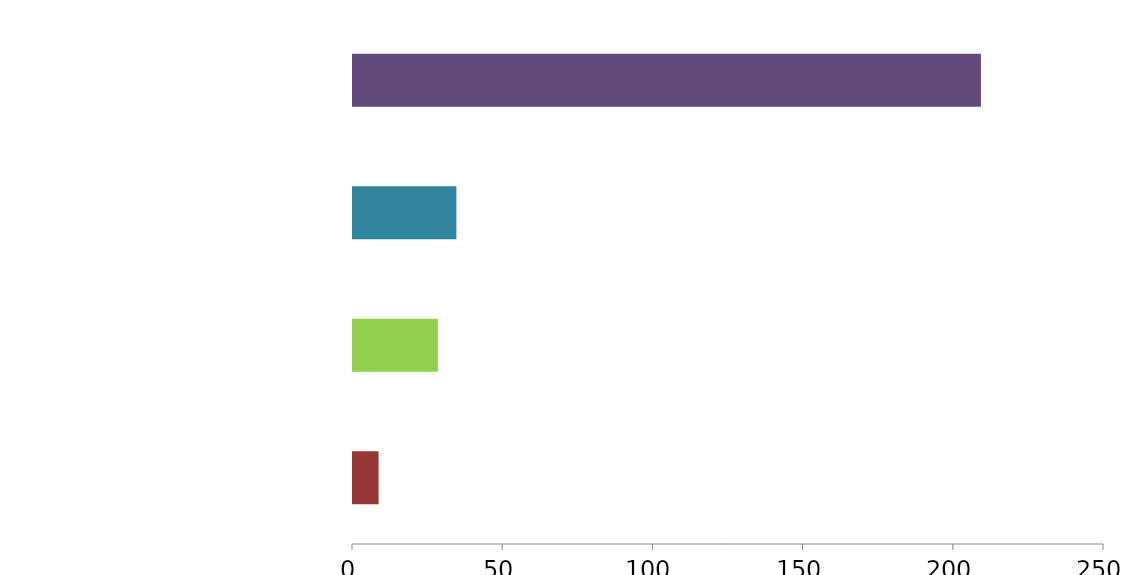
| Category | Series 0 |
|---|---|
| Great Britain (+9k) | 8.509 |
| Republic of Ireland (+28k) | 28.249 |
| Outside GB and Ireland (+74k) | 34.42 |
| Northern Ireland (+209k) | 209.036 |